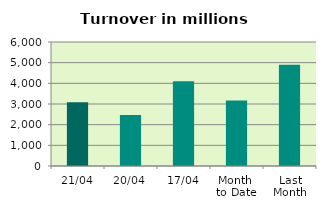
| Category | Series 0 |
|---|---|
| 21/04 | 3090.43 |
| 20/04 | 2468.365 |
| 17/04 | 4094.894 |
| Month 
to Date | 3168.182 |
| Last
Month | 4897.629 |